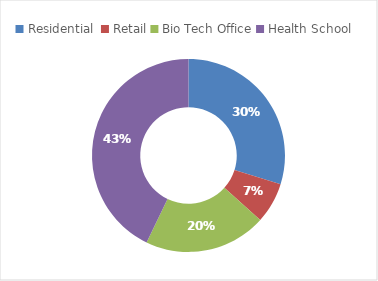
| Category | Series 0 |
|---|---|
| Residential  | 104564 |
| Retail | 23954 |
| Bio Tech Office | 71791 |
| Health School | 150177 |